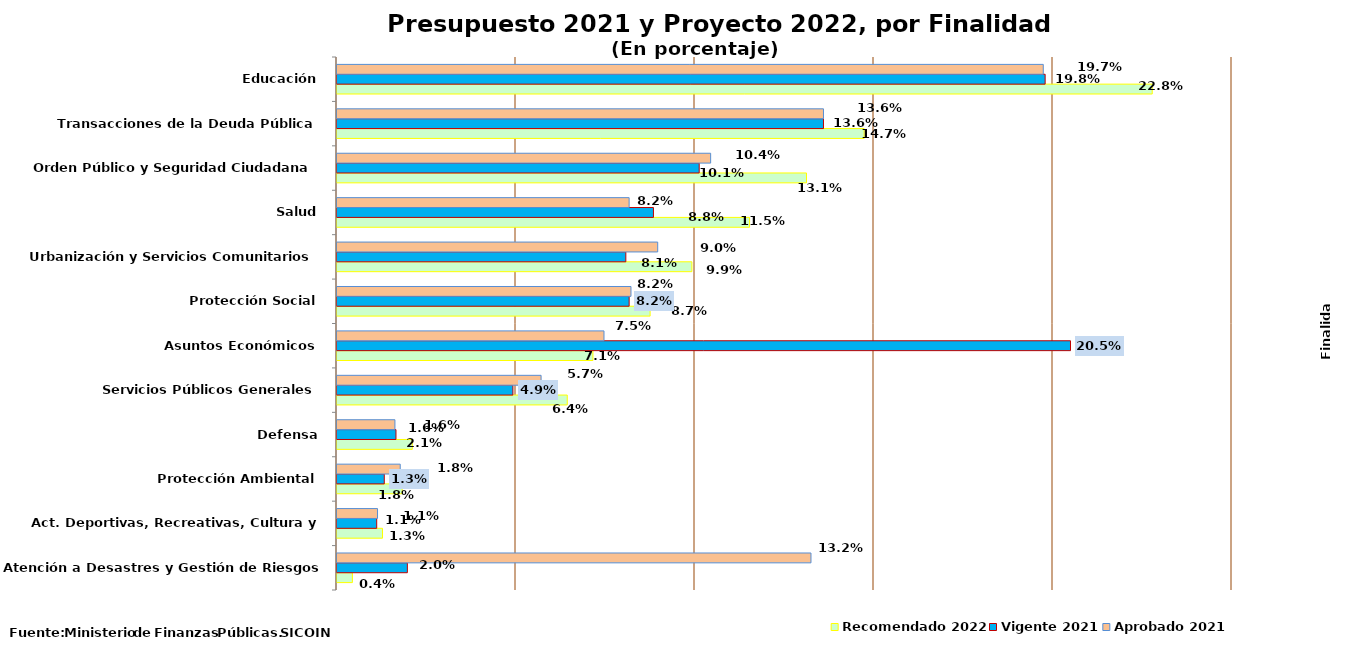
| Category | Recomendado 2022 | Vigente 2021 | Aprobado 2021 |
|---|---|---|---|
| Atención a Desastres y Gestión de Riesgos | 0.004 | 0.02 | 0.132 |
| Act. Deportivas, Recreativas, Cultura y Religión | 0.013 | 0.011 | 0.011 |
| Protección Ambiental | 0.018 | 0.013 | 0.018 |
| Defensa | 0.021 | 0.016 | 0.016 |
| Servicios Públicos Generales | 0.064 | 0.049 | 0.057 |
| Asuntos Económicos | 0.071 | 0.205 | 0.075 |
| Protección Social | 0.087 | 0.082 | 0.082 |
| Urbanización y Servicios Comunitarios | 0.099 | 0.081 | 0.09 |
| Salud | 0.115 | 0.088 | 0.082 |
| Orden Público y Seguridad Ciudadana | 0.131 | 0.101 | 0.104 |
| Transacciones de la Deuda Pública | 0.147 | 0.136 | 0.136 |
| Educación | 0.228 | 0.198 | 0.197 |